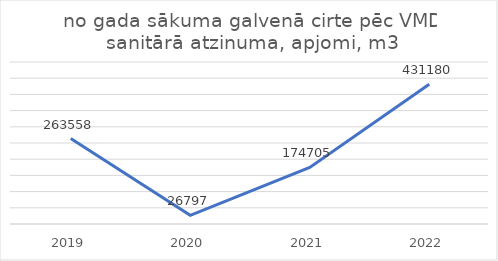
| Category | no gada sākuma galvenā cirte pēc VMD sanitārā atzinuma, apjomi, m3 |
|---|---|
| 2019.0 | 263558 |
| 2020.0 | 26797 |
| 2021.0 | 174705 |
| 2022.0 | 431180 |